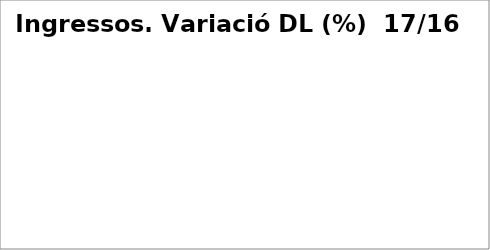
| Category | Series 0 |
|---|---|
| Impostos directes | 0.037 |
| Impostos indirectes | 0.035 |
| Taxes, preus públics i altres ingressos | -0.194 |
| Transferències corrents | 0.024 |
| Ingressos patrimonials | 0.095 |
| Venda d'inversions reals | 4.684 |
| Transferències de capital | -0.928 |
| Actius financers* | -1 |
| Passius financers | 0.3 |